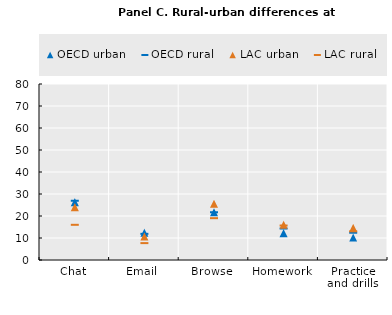
| Category | OECD | LAC |
|---|---|---|
| Chat | 26.932 | 15.996 |
| Email | 11.893 | 7.674 |
| Browse | 21.707 | 19.014 |
| Homework | 14.312 | 15.666 |
| Practice and drills | 12.398 | 13.03 |